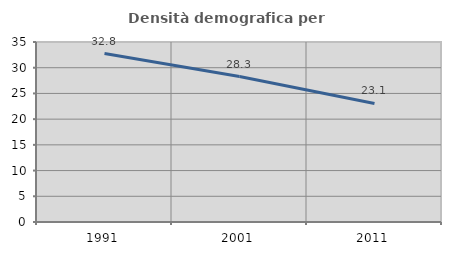
| Category | Densità demografica |
|---|---|
| 1991.0 | 32.756 |
| 2001.0 | 28.279 |
| 2011.0 | 23.054 |